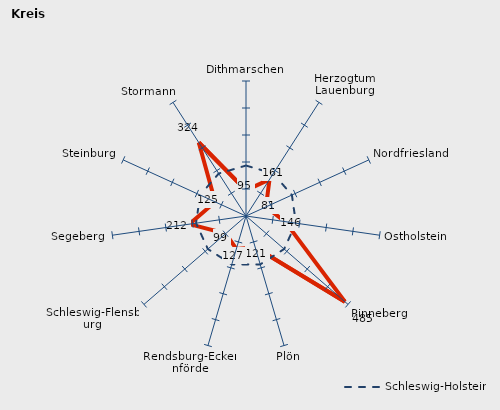
| Category | Kreise | Schleswig-Holstein |
|---|---|---|
| Dithmarschen | 94.703 | 186.865 |
| Herzogtum Lauenburg | 161.284 | 186.865 |
| Nordfriesland | 81.132 | 186.865 |
| Ostholstein | 146.162 | 186.865 |
| Pinneberg | 484.95 | 186.865 |
| Plön | 121.143 | 186.865 |
| Rendsburg-Eckernförde | 127.4 | 186.865 |
| Schleswig-Flensburg | 99.474 | 186.865 |
| Segeberg | 211.971 | 186.865 |
| Steinburg | 125.433 | 186.865 |
| Stormann | 323.634 | 186.865 |